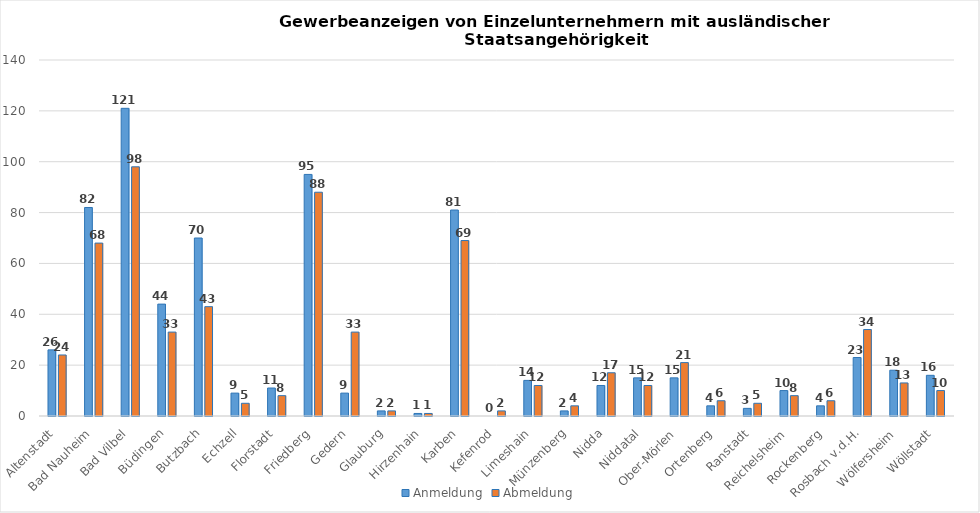
| Category | Anmeldung | Abmeldung |
|---|---|---|
| Altenstadt | 26 | 24 |
| Bad Nauheim | 82 | 68 |
| Bad Vilbel | 121 | 98 |
| Büdingen | 44 | 33 |
| Butzbach | 70 | 43 |
| Echzell | 9 | 5 |
| Florstadt | 11 | 8 |
| Friedberg | 95 | 88 |
| Gedern | 9 | 33 |
| Glauburg | 2 | 2 |
| Hirzenhain | 1 | 1 |
| Karben | 81 | 69 |
| Kefenrod | 0 | 2 |
| Limeshain | 14 | 12 |
| Münzenberg | 2 | 4 |
| Nidda | 12 | 17 |
| Niddatal | 15 | 12 |
| Ober-Mörlen | 15 | 21 |
| Ortenberg | 4 | 6 |
| Ranstadt | 3 | 5 |
| Reichelsheim | 10 | 8 |
| Rockenberg | 4 | 6 |
| Rosbach v.d.H. | 23 | 34 |
| Wölfersheim | 18 | 13 |
| Wöllstadt | 16 | 10 |